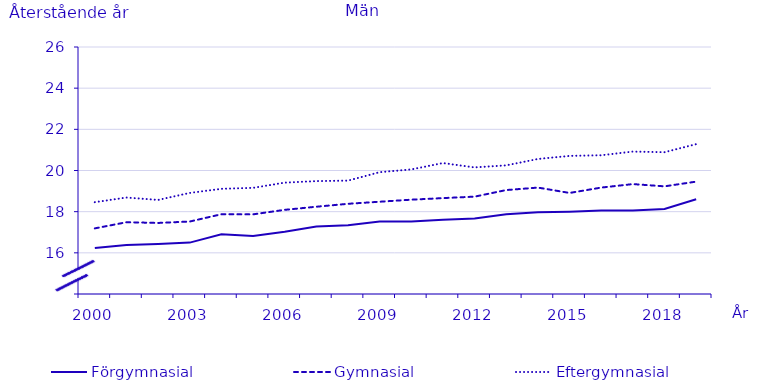
| Category | Förgymnasial | Gymnasial | Eftergymnasial |
|---|---|---|---|
| 2000.0 | 16.235 | 17.187 | 18.462 |
| 2001.0 | 16.382 | 17.487 | 18.686 |
| 2002.0 | 16.431 | 17.452 | 18.571 |
| 2003.0 | 16.497 | 17.521 | 18.91 |
| 2004.0 | 16.902 | 17.875 | 19.111 |
| 2005.0 | 16.817 | 17.87 | 19.157 |
| 2006.0 | 17.022 | 18.089 | 19.41 |
| 2007.0 | 17.28 | 18.24 | 19.485 |
| 2008.0 | 17.342 | 18.382 | 19.509 |
| 2009.0 | 17.518 | 18.483 | 19.918 |
| 2010.0 | 17.52 | 18.583 | 20.052 |
| 2011.0 | 17.607 | 18.659 | 20.362 |
| 2012.0 | 17.67 | 18.73 | 20.15 |
| 2013.0 | 17.88 | 19.05 | 20.25 |
| 2014.0 | 17.97 | 19.17 | 20.56 |
| 2015.0 | 18 | 18.91 | 20.71 |
| 2016.0 | 18.06 | 19.17 | 20.74 |
| 2017.0 | 18.06 | 19.34 | 20.92 |
| 2018.0 | 18.13 | 19.23 | 20.89 |
| 2019.0 | 18.6 | 19.46 | 21.28 |